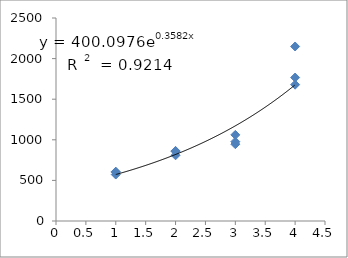
| Category | Series 0 |
|---|---|
| 1.0 | 572.247 |
| 1.0 | 601.283 |
| 1.0 | 607.332 |
| 2.0 | 857.226 |
| 2.0 | 809.27 |
| 2.0 | 863.221 |
| 3.0 | 976.549 |
| 3.0 | 1060.748 |
| 3.0 | 946.072 |
| 4.0 | 1678.949 |
| 4.0 | 2149.131 |
| 4.0 | 1766.816 |